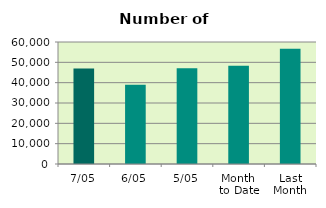
| Category | Series 0 |
|---|---|
| 7/05 | 46906 |
| 6/05 | 39036 |
| 5/05 | 47074 |
| Month 
to Date | 48380 |
| Last
Month | 56719.3 |